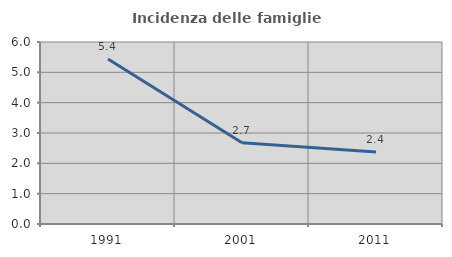
| Category | Incidenza delle famiglie numerose |
|---|---|
| 1991.0 | 5.442 |
| 2001.0 | 2.677 |
| 2011.0 | 2.37 |